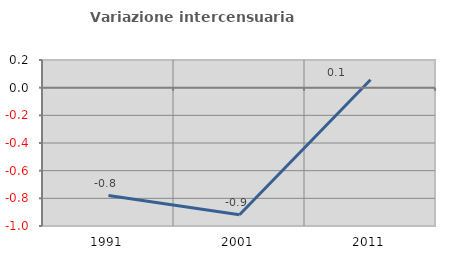
| Category | Variazione intercensuaria annua |
|---|---|
| 1991.0 | -0.78 |
| 2001.0 | -0.918 |
| 2011.0 | 0.057 |